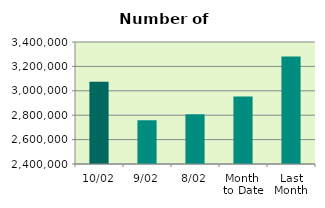
| Category | Series 0 |
|---|---|
| 10/02 | 3074404 |
| 9/02 | 2758538 |
| 8/02 | 2807212 |
| Month 
to Date | 2954229 |
| Last
Month | 3281385.4 |